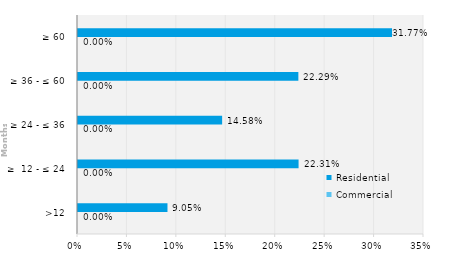
| Category | Commercial | Residential |
|---|---|---|
| >12 | 0 | 0.091 |
| ≥  12 - ≤ 24 | 0 | 0.223 |
| ≥ 24 - ≤ 36 | 0 | 0.146 |
| ≥ 36 - ≤ 60 | 0 | 0.223 |
| ≥ 60 | 0 | 0.318 |